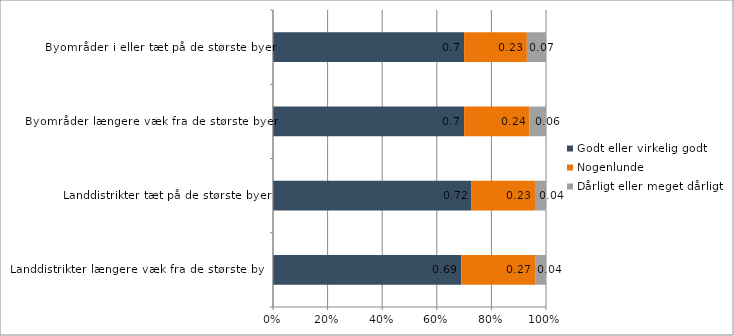
| Category | Godt eller virkelig godt | Nogenlunde | Dårligt eller meget dårligt |
|---|---|---|---|
| Landdistrikter længere væk fra de største byer | 0.69 | 0.27 | 0.04 |
| Landdistrikter tæt på de største byer | 0.72 | 0.23 | 0.04 |
| Byområder længere væk fra de største byer | 0.7 | 0.24 | 0.06 |
| Byområder i eller tæt på de største byer | 0.7 | 0.23 | 0.07 |